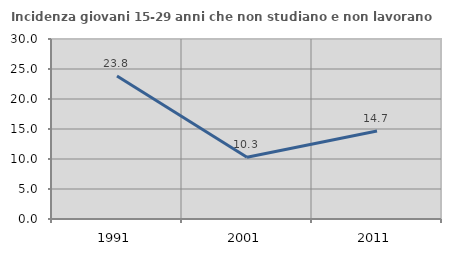
| Category | Incidenza giovani 15-29 anni che non studiano e non lavorano  |
|---|---|
| 1991.0 | 23.832 |
| 2001.0 | 10.283 |
| 2011.0 | 14.668 |